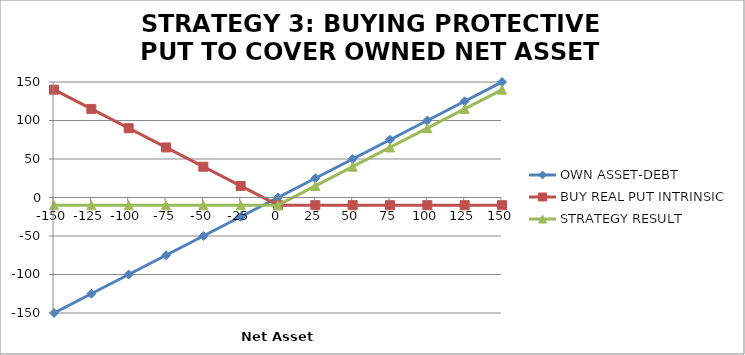
| Category | OWN ASSET-DEBT | BUY REAL PUT INTRINSIC | STRATEGY RESULT |
|---|---|---|---|
| -150.0 | -150 | 140 | -10 |
| -125.0 | -125 | 115 | -10 |
| -100.0 | -100 | 90 | -10 |
| -75.0 | -75 | 65 | -10 |
| -50.0 | -50 | 40 | -10 |
| -25.0 | -25 | 15 | -10 |
| 0.0 | 0 | -10 | -10 |
| 25.0 | 25 | -10 | 15 |
| 50.0 | 50 | -10 | 40 |
| 75.0 | 75 | -10 | 65 |
| 100.0 | 100 | -10 | 90 |
| 125.0 | 125 | -10 | 115 |
| 150.0 | 150 | -10 | 140 |